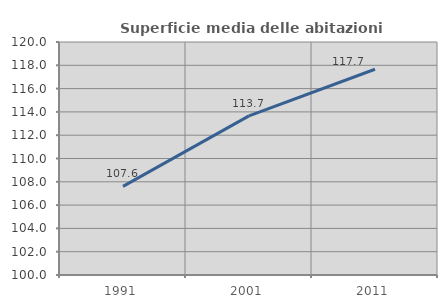
| Category | Superficie media delle abitazioni occupate |
|---|---|
| 1991.0 | 107.608 |
| 2001.0 | 113.655 |
| 2011.0 | 117.658 |